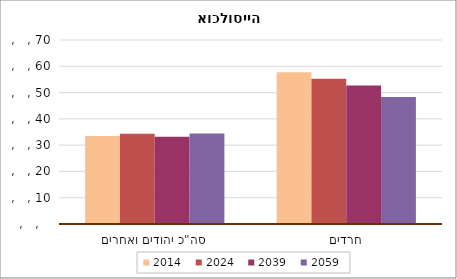
| Category | 2014 | 2024 | 2039 | 2059 |
|---|---|---|---|---|
| סה"כ יהודים ואחרים | 33.465 | 34.295 | 33.206 | 34.458 |
| חרדים | 57.705 | 55.211 | 52.677 | 48.357 |